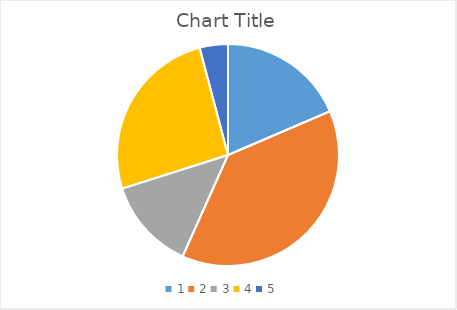
| Category | Series 0 |
|---|---|
| 0 | 18.557 |
| 1 | 38.144 |
| 2 | 13.402 |
| 3 | 25.773 |
| 4 | 4.124 |